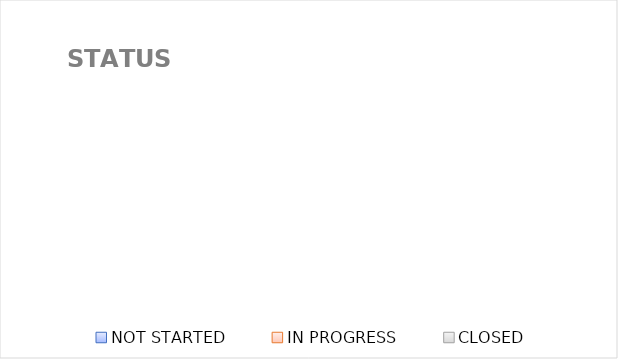
| Category | Series 0 |
|---|---|
| NOT STARTED | 0 |
| IN PROGRESS | 0 |
| CLOSED | 0 |